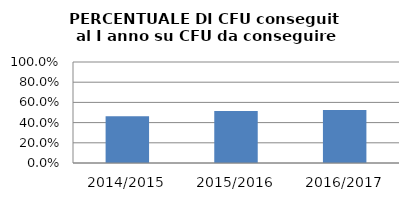
| Category | 2014/2015 2015/2016 2016/2017 |
|---|---|
| 2014/2015 | 0.464 |
| 2015/2016 | 0.514 |
| 2016/2017 | 0.525 |